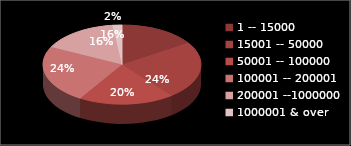
| Category | Series 0 |
|---|---|
| 1 -- 15000 | 8 |
| 15001 -- 50000 | 12 |
| 50001 -- 100000 | 10 |
| 100001 -- 200001 | 12 |
| 200001 --1000000 | 8 |
| 1000001 & over | 1 |